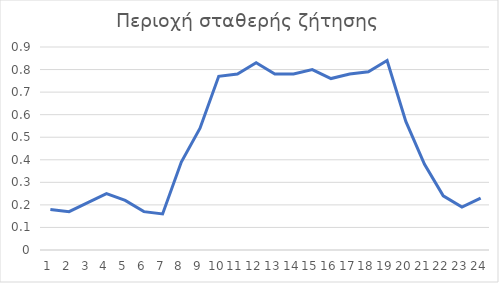
| Category | Series 0 |
|---|---|
| 0 | 0.18 |
| 1 | 0.17 |
| 2 | 0.21 |
| 3 | 0.25 |
| 4 | 0.22 |
| 5 | 0.17 |
| 6 | 0.16 |
| 7 | 0.39 |
| 8 | 0.54 |
| 9 | 0.77 |
| 10 | 0.78 |
| 11 | 0.83 |
| 12 | 0.78 |
| 13 | 0.78 |
| 14 | 0.8 |
| 15 | 0.76 |
| 16 | 0.78 |
| 17 | 0.79 |
| 18 | 0.84 |
| 19 | 0.57 |
| 20 | 0.38 |
| 21 | 0.24 |
| 22 | 0.19 |
| 23 | 0.23 |